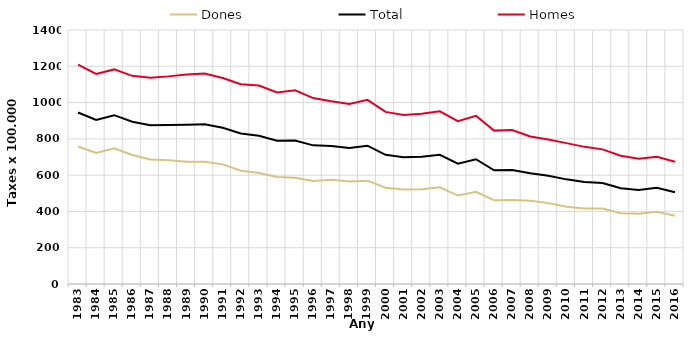
| Category | Dones | Total | Homes |
|---|---|---|---|
| 1983.0 | 757.55 | 945.2 | 1209.33 |
| 1984.0 | 722.5 | 903.77 | 1157.81 |
| 1985.0 | 748.02 | 930.54 | 1182.77 |
| 1986.0 | 710.75 | 894.58 | 1147.18 |
| 1987.0 | 686.43 | 874.76 | 1137.29 |
| 1988.0 | 682.17 | 876.5 | 1144.37 |
| 1989.0 | 673.39 | 877.27 | 1155.14 |
| 1990.0 | 673.55 | 879.86 | 1160.19 |
| 1991.0 | 659.34 | 861.29 | 1135.42 |
| 1992.0 | 623.98 | 829.12 | 1101.2 |
| 1993.0 | 611.62 | 817.24 | 1094.39 |
| 1994.0 | 590.18 | 789.13 | 1056.02 |
| 1995.0 | 585.87 | 791.39 | 1067.49 |
| 1996.0 | 568.31 | 764.13 | 1024.64 |
| 1997.0 | 575.02 | 761.09 | 1006.75 |
| 1998.0 | 564.51 | 749.96 | 992.16 |
| 1999.0 | 569.6 | 762.4 | 1015 |
| 2000.0 | 530.4 | 712.2 | 948.6 |
| 2001.0 | 520.3 | 699 | 931.2 |
| 2002.0 | 522.6 | 701.1 | 938.1 |
| 2003.0 | 532.8 | 712.2 | 952.1 |
| 2004.0 | 487.5 | 663.1 | 897.3 |
| 2005.0 | 508.1 | 687.5 | 927.1 |
| 2006.0 | 461.55 | 626.49 | 845.43 |
| 2007.0 | 462.44 | 628.19 | 848.32 |
| 2008.0 | 458.87 | 610.96 | 812.88 |
| 2009.0 | 445.772 | 597.162 | 796.459 |
| 2010.0 | 425.89 | 576.76 | 776.47 |
| 2011.0 | 416.05 | 562.54 | 755.89 |
| 2012.0 | 415.56 | 556.82 | 742.13 |
| 2013.0 | 389.91 | 527.62 | 706.62 |
| 2014.0 | 386.57 | 518.06 | 689.84 |
| 2015.0 | 398.24 | 530.64 | 701.77 |
| 2016.0 | 376.68 | 505.9 | 673.63 |